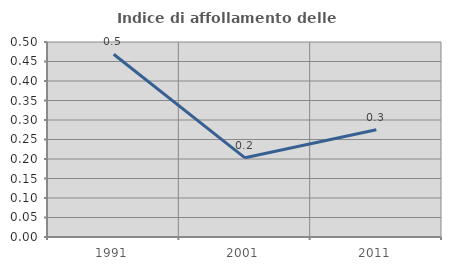
| Category | Indice di affollamento delle abitazioni  |
|---|---|
| 1991.0 | 0.469 |
| 2001.0 | 0.203 |
| 2011.0 | 0.275 |